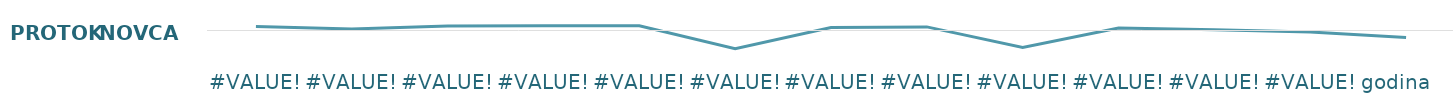
| Category | Protok novca |
|---|---|
| #VALUE! | 169 |
| #VALUE! | 69 |
| #VALUE! | 192 |
| #VALUE! | 199 |
| #VALUE! | 204 |
| #VALUE! | -771 |
| #VALUE! | 124 |
| #VALUE! | 154 |
| #VALUE! | -721 |
| #VALUE! | 109 |
| #VALUE! | 34 |
| #VALUE! | -61 |
| godina   | -299 |